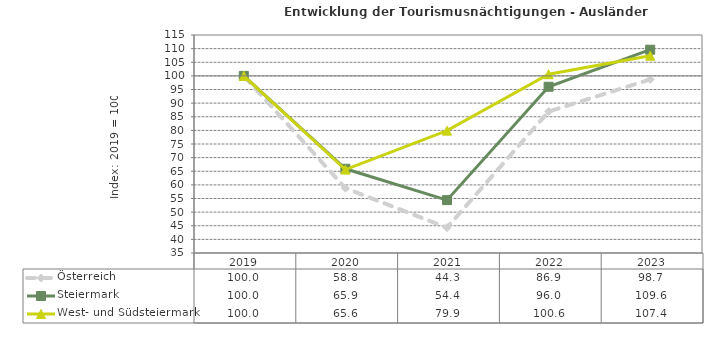
| Category | Österreich | Steiermark | West- und Südsteiermark |
|---|---|---|---|
| 2023.0 | 98.7 | 109.6 | 107.4 |
| 2022.0 | 86.9 | 96 | 100.6 |
| 2021.0 | 44.3 | 54.4 | 79.9 |
| 2020.0 | 58.8 | 65.9 | 65.6 |
| 2019.0 | 100 | 100 | 100 |